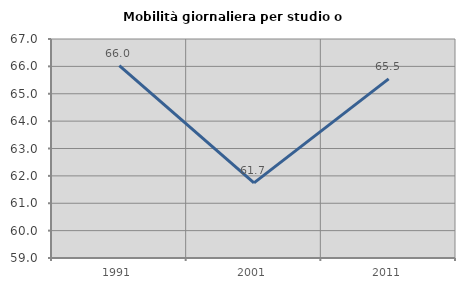
| Category | Mobilità giornaliera per studio o lavoro |
|---|---|
| 1991.0 | 66.028 |
| 2001.0 | 61.745 |
| 2011.0 | 65.544 |